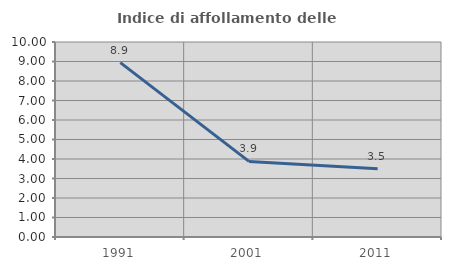
| Category | Indice di affollamento delle abitazioni  |
|---|---|
| 1991.0 | 8.94 |
| 2001.0 | 3.875 |
| 2011.0 | 3.503 |